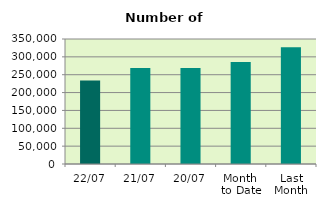
| Category | Series 0 |
|---|---|
| 22/07 | 233482 |
| 21/07 | 268486 |
| 20/07 | 268896 |
| Month 
to Date | 285525 |
| Last
Month | 326674.818 |